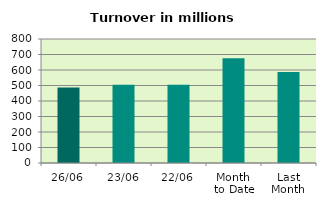
| Category | Series 0 |
|---|---|
| 26/06 | 486.451 |
| 23/06 | 505.494 |
| 22/06 | 504.147 |
| Month 
to Date | 675.923 |
| Last
Month | 587.249 |